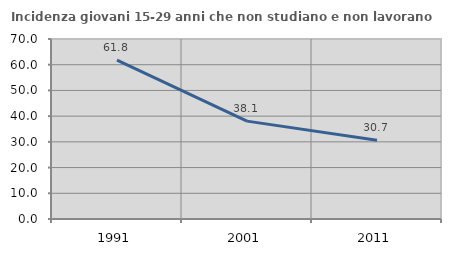
| Category | Incidenza giovani 15-29 anni che non studiano e non lavorano  |
|---|---|
| 1991.0 | 61.776 |
| 2001.0 | 38.067 |
| 2011.0 | 30.657 |